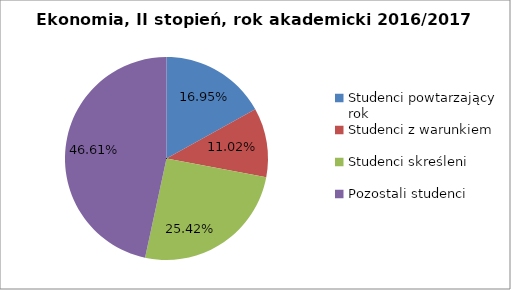
| Category | Series 0 |
|---|---|
| Studenci powtarzający rok | 20 |
| Studenci z warunkiem | 13 |
| Studenci skreśleni | 30 |
| Pozostali studenci | 55 |